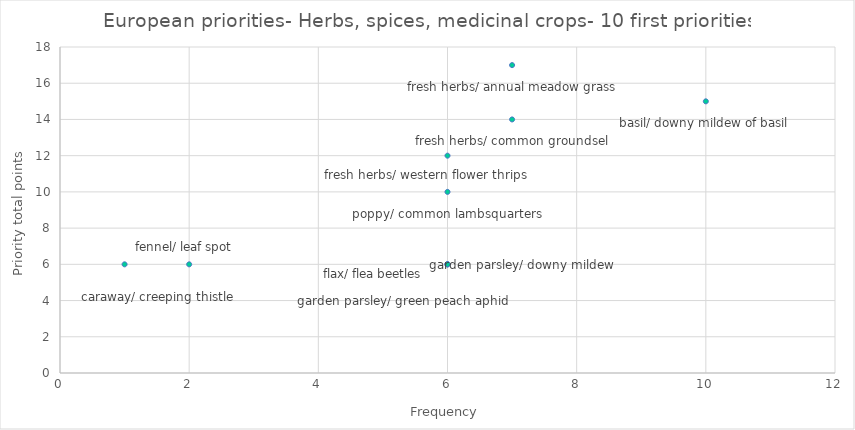
| Category | Series 0 |
|---|---|
| 7.0 | 17 |
| 10.0 | 15 |
| 7.0 | 14 |
| 6.0 | 12 |
| 6.0 | 10 |
| 1.0 | 6 |
| 2.0 | 6 |
| 6.0 | 6 |
| 6.0 | 6 |
| 6.0 | 6 |